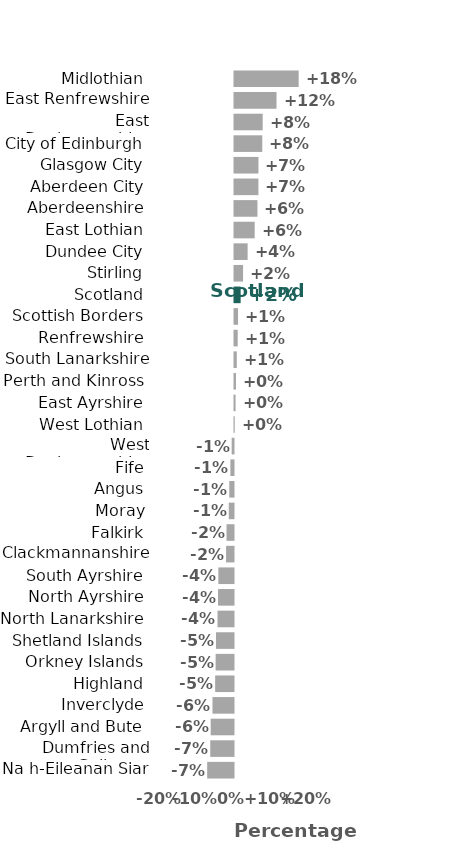
| Category | Series 0 |
|---|---|
| Na h-Eileanan Siar | -7.36 |
| Dumfries and Galloway | -6.5 |
| Argyll and Bute | -6.383 |
| Inverclyde | -5.875 |
| Highland | -5.131 |
| Orkney Islands | -5.006 |
| Shetland Islands | -4.89 |
| North Lanarkshire | -4.476 |
| North Ayrshire | -4.324 |
| South Ayrshire | -4.24 |
| Clackmannanshire | -2.072 |
| Falkirk | -1.957 |
| Moray | -1.325 |
| Angus | -1.183 |
| Fife | -0.865 |
| West Dunbartonshire | -0.514 |
| West Lothian | 0.065 |
| East Ayrshire | 0.301 |
| Perth and Kinross | 0.408 |
| South Lanarkshire | 0.64 |
| Renfrewshire | 0.895 |
| Scottish Borders | 0.989 |
| Scotland | 1.72 |
| Stirling | 2.395 |
| Dundee City | 3.673 |
| East Lothian | 5.645 |
| Aberdeenshire | 6.423 |
| Aberdeen City | 6.69 |
| Glasgow City | 6.702 |
| City of Edinburgh | 7.771 |
| East Dunbartonshire | 7.889 |
| East Renfrewshire | 11.751 |
| Midlothian | 17.946 |